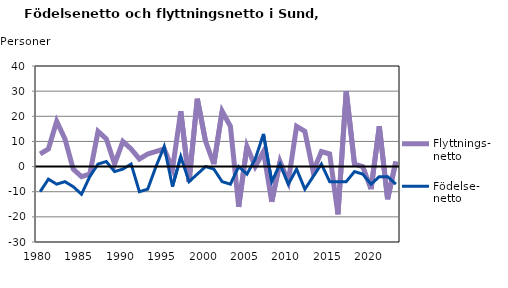
| Category | Flyttnings- netto | Födelse- netto |
|---|---|---|
| 1980.0 | 5 | -10 |
| 1981.0 | 7 | -5 |
| 1982.0 | 18 | -7 |
| 1983.0 | 11 | -6 |
| 1984.0 | -1 | -8 |
| 1985.0 | -4 | -11 |
| 1986.0 | -3 | -4 |
| 1987.0 | 14 | 1 |
| 1988.0 | 11 | 2 |
| 1989.0 | 1 | -2 |
| 1990.0 | 10 | -1 |
| 1991.0 | 7 | 1 |
| 1992.0 | 3 | -10 |
| 1993.0 | 5 | -9 |
| 1994.0 | 6 | 0 |
| 1995.0 | 7 | 8 |
| 1996.0 | -1 | -8 |
| 1997.0 | 22 | 4 |
| 1998.0 | -6 | -6 |
| 1999.0 | 27 | -3 |
| 2000.0 | 10 | 0 |
| 2001.0 | 1 | -1 |
| 2002.0 | 22 | -6 |
| 2003.0 | 16 | -7 |
| 2004.0 | -16 | 0 |
| 2005.0 | 8 | -3 |
| 2006.0 | 0 | 3 |
| 2007.0 | 6 | 13 |
| 2008.0 | -14 | -6 |
| 2009.0 | 2 | 1 |
| 2010.0 | -6 | -7 |
| 2011.0 | 16 | -1 |
| 2012.0 | 14 | -9 |
| 2013.0 | -2 | -4 |
| 2014.0 | 6 | 1 |
| 2015.0 | 5 | -6 |
| 2016.0 | -19 | -6 |
| 2017.0 | 30 | -6 |
| 2018.0 | 1 | -2 |
| 2019.0 | 0 | -3 |
| 2020.0 | -9 | -7 |
| 2021.0 | 16 | -4 |
| 2022.0 | -13 | -4 |
| 2023.0 | 2 | -7 |